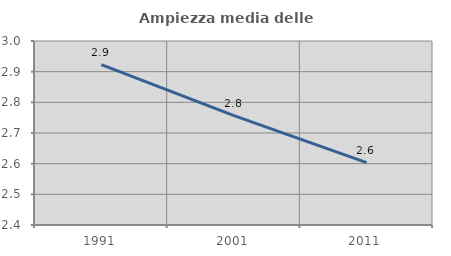
| Category | Ampiezza media delle famiglie |
|---|---|
| 1991.0 | 2.923 |
| 2001.0 | 2.757 |
| 2011.0 | 2.603 |